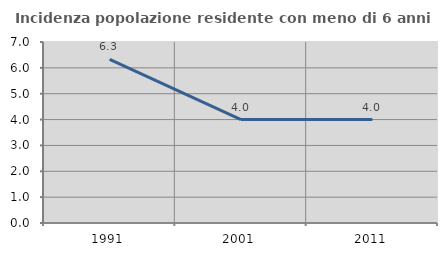
| Category | Incidenza popolazione residente con meno di 6 anni |
|---|---|
| 1991.0 | 6.332 |
| 2001.0 | 4.001 |
| 2011.0 | 3.998 |